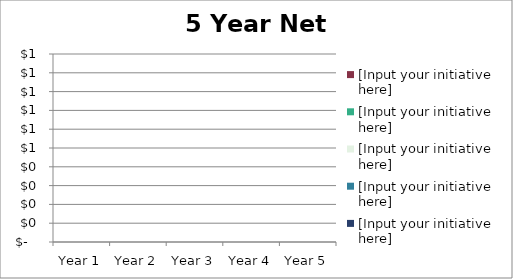
| Category | [Input your initiative here] |
|---|---|
| Year 1 | 0 |
| Year 2 | 0 |
| Year 3 | 0 |
| Year 4 | 0 |
| Year 5 | 0 |